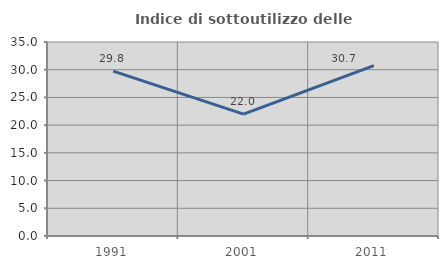
| Category | Indice di sottoutilizzo delle abitazioni  |
|---|---|
| 1991.0 | 29.758 |
| 2001.0 | 21.994 |
| 2011.0 | 30.747 |